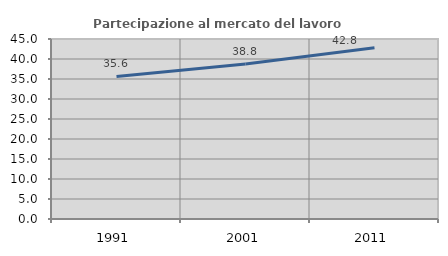
| Category | Partecipazione al mercato del lavoro  femminile |
|---|---|
| 1991.0 | 35.64 |
| 2001.0 | 38.778 |
| 2011.0 | 42.823 |